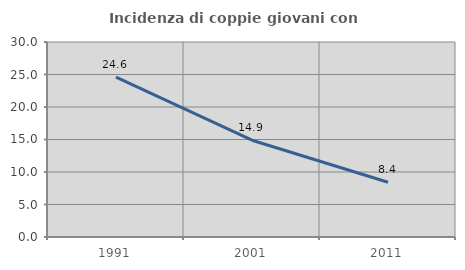
| Category | Incidenza di coppie giovani con figli |
|---|---|
| 1991.0 | 24.593 |
| 2001.0 | 14.89 |
| 2011.0 | 8.427 |